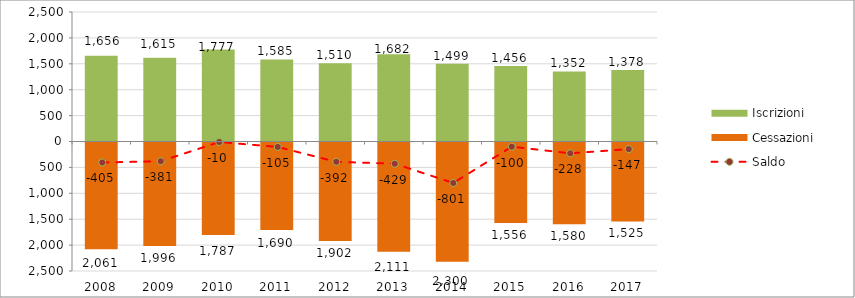
| Category | Iscrizioni | Cessazioni |
|---|---|---|
| 2008.0 | 1656 | -2061 |
| 2009.0 | 1615 | -1996 |
| 2010.0 | 1777 | -1787 |
| 2011.0 | 1585 | -1690 |
| 2012.0 | 1510 | -1902 |
| 2013.0 | 1682 | -2111 |
| 2014.0 | 1499 | -2300 |
| 2015.0 | 1456 | -1556 |
| 2016.0 | 1352 | -1580 |
| 2017.0 | 1378 | -1525 |